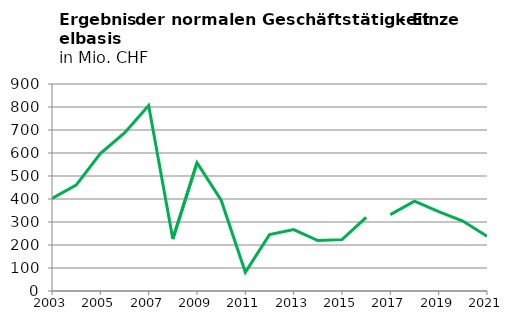
| Category | Ergebnis der normalen Geschäftstätigkeit in Mio. CHF |
|---|---|
| 2003.0 | 401.952 |
| 2004.0 | 460.513 |
| 2005.0 | 597.155 |
| 2006.0 | 686.947 |
| 2007.0 | 806.673 |
| 2008.0 | 225.981 |
| 2009.0 | 557.457 |
| 2010.0 | 394.638 |
| 2011.0 | 81.537 |
| 2012.0 | 245.298 |
| 2013.0 | 266.727 |
| 2014.0 | 219.495 |
| 2015.0 | 223.299 |
| 2016.0 | 320.264 |
| 2017.0 | 331.926 |
| 2018.0 | 390.324 |
| 2019.0 | 345.143 |
| 2020.0 | 304.293 |
| 2021.0 | 238.402 |